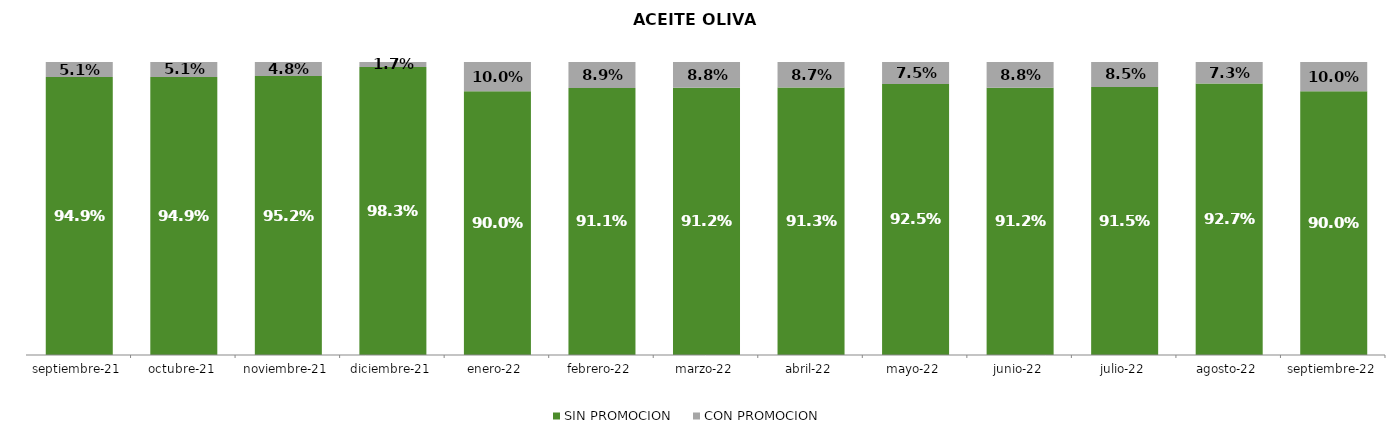
| Category | SIN PROMOCION   | CON PROMOCION   |
|---|---|---|
| 2021-09-01 | 0.949 | 0.051 |
| 2021-10-01 | 0.949 | 0.051 |
| 2021-11-01 | 0.952 | 0.048 |
| 2021-12-01 | 0.983 | 0.017 |
| 2022-01-01 | 0.9 | 0.1 |
| 2022-02-01 | 0.911 | 0.089 |
| 2022-03-01 | 0.912 | 0.088 |
| 2022-04-01 | 0.913 | 0.087 |
| 2022-05-01 | 0.925 | 0.075 |
| 2022-06-01 | 0.912 | 0.088 |
| 2022-07-01 | 0.915 | 0.085 |
| 2022-08-01 | 0.927 | 0.073 |
| 2022-09-01 | 0.9 | 0.1 |